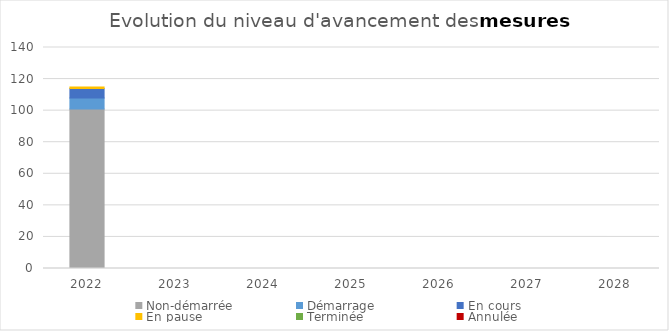
| Category | Non-démarrée | Démarrage | En cours | En pause | Terminée | Annulée |
|---|---|---|---|---|---|---|
| 2022.0 | 101 | 7 | 6 | 1 | 0 | 0 |
| 2023.0 | 0 | 0 | 0 | 0 | 0 | 0 |
| 2024.0 | 0 | 0 | 0 | 0 | 0 | 0 |
| 2025.0 | 0 | 0 | 0 | 0 | 0 | 0 |
| 2026.0 | 0 | 0 | 0 | 0 | 0 | 0 |
| 2027.0 | 0 | 0 | 0 | 0 | 0 | 0 |
| 2028.0 | 0 | 0 | 0 | 0 | 0 | 0 |